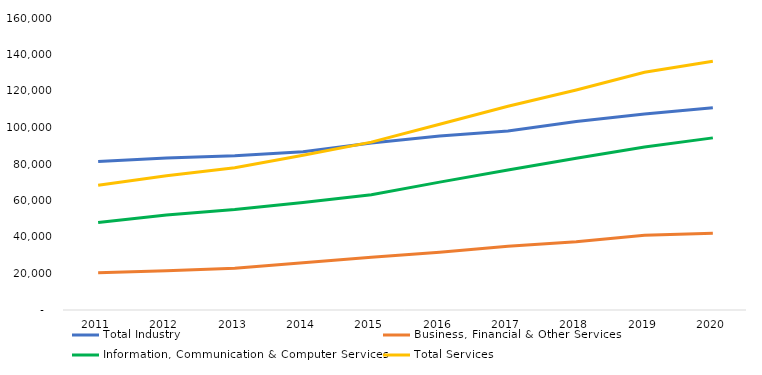
| Category | Total Industry | Business, Financial & Other Services | Information, Communication & Computer Services | Total Services |
|---|---|---|---|---|
| 2011.0 | 81385 | 20409 | 47903 | 68312 |
| 2012.0 | 83336 | 21498 | 52068 | 73566 |
| 2013.0 | 84587 | 22917 | 55032 | 77949 |
| 2014.0 | 86758 | 25932 | 58898 | 84830 |
| 2015.0 | 91502 | 28848 | 63128 | 91976 |
| 2016.0 | 95383 | 31684 | 70064 | 101748 |
| 2017.0 | 98138 | 34951 | 76674 | 111625 |
| 2018.0 | 103306 | 37333 | 83203 | 120536 |
| 2019.0 | 107448 | 40964 | 89333 | 130297 |
| 2020.0 | 110879 | 41995 | 94321 | 136316 |